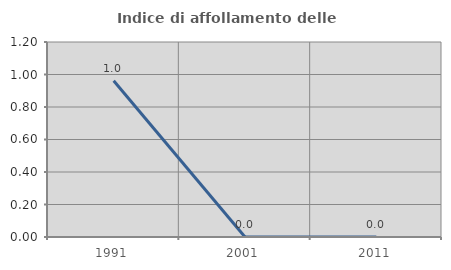
| Category | Indice di affollamento delle abitazioni  |
|---|---|
| 1991.0 | 0.962 |
| 2001.0 | 0 |
| 2011.0 | 0 |